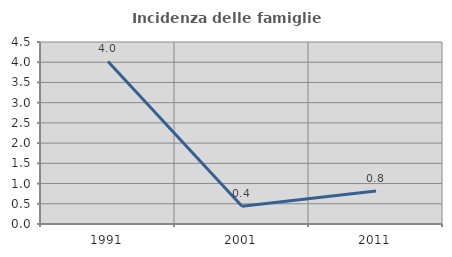
| Category | Incidenza delle famiglie numerose |
|---|---|
| 1991.0 | 4.02 |
| 2001.0 | 0.44 |
| 2011.0 | 0.818 |